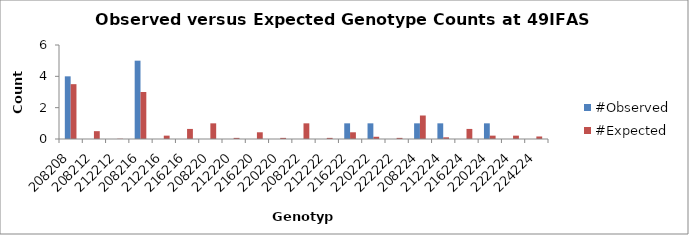
| Category | #Observed | #Expected |
|---|---|---|
| 208208.0 | 4 | 3.5 |
| 208212.0 | 0 | 0.5 |
| 212212.0 | 0 | 0.018 |
| 208216.0 | 5 | 3 |
| 212216.0 | 0 | 0.214 |
| 216216.0 | 0 | 0.643 |
| 208220.0 | 0 | 1 |
| 212220.0 | 0 | 0.071 |
| 216220.0 | 0 | 0.429 |
| 220220.0 | 0 | 0.071 |
| 208222.0 | 0 | 1 |
| 212222.0 | 0 | 0.071 |
| 216222.0 | 1 | 0.429 |
| 220222.0 | 1 | 0.143 |
| 222222.0 | 0 | 0.071 |
| 208224.0 | 1 | 1.5 |
| 212224.0 | 1 | 0.107 |
| 216224.0 | 0 | 0.643 |
| 220224.0 | 1 | 0.214 |
| 222224.0 | 0 | 0.214 |
| 224224.0 | 0 | 0.161 |